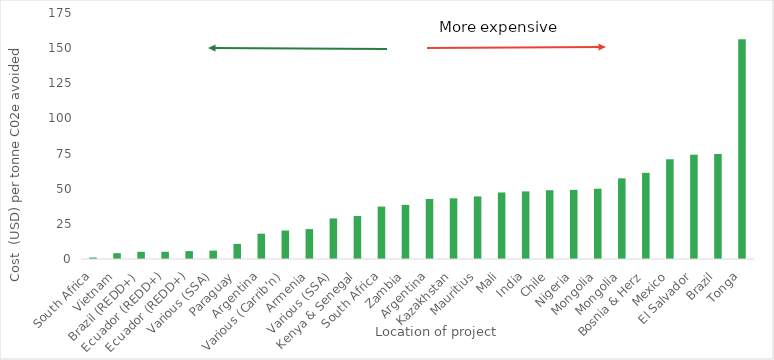
| Category | Cost per tonne of Co2e avoided |
|---|---|
| South Africa | 1.033 |
| Vietnam | 4.143 |
| Brazil (REDD+) | 5.106 |
| Ecuador (REDD+) | 5.167 |
| Ecuador (REDD+) | 5.6 |
| Various (SSA) | 5.96 |
| Paraguay | 10.75 |
| Argentina | 18.011 |
| Various (Carrib'n) | 20.266 |
| Armenia | 21.286 |
| Various (SSA) | 28.875 |
| Kenya & Senegal | 30.568 |
| South Africa | 37.292 |
| Zambia | 38.5 |
| Argentina | 42.68 |
| Kazakhstan | 43.178 |
| Mauritius | 44.512 |
| Mali | 47.335 |
| India | 48.077 |
| Chile | 48.919 |
| Nigeria | 49.158 |
| Mongolia | 50 |
| Mongolia | 57.385 |
| Bosnia & Herz | 61.3 |
| Mexico | 70.962 |
| El Salvador | 74.199 |
| Brazil | 74.713 |
| Tonga | 156.287 |